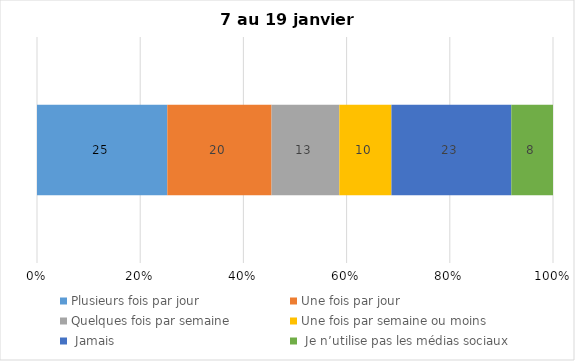
| Category | Plusieurs fois par jour | Une fois par jour | Quelques fois par semaine   | Une fois par semaine ou moins   |  Jamais   |  Je n’utilise pas les médias sociaux |
|---|---|---|---|---|---|---|
| 0 | 25 | 20 | 13 | 10 | 23 | 8 |